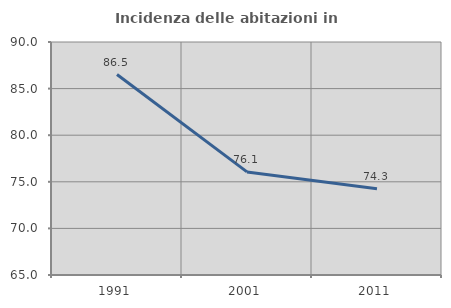
| Category | Incidenza delle abitazioni in proprietà  |
|---|---|
| 1991.0 | 86.512 |
| 2001.0 | 76.063 |
| 2011.0 | 74.255 |